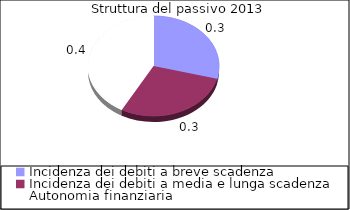
| Category | Series1 |
|---|---|
| Incidenza dei debiti a breve scadenza | 0.292 |
| Incidenza dei debiti a media e lunga scadenza | 0.289 |
| Autonomia finanziaria | 0.42 |